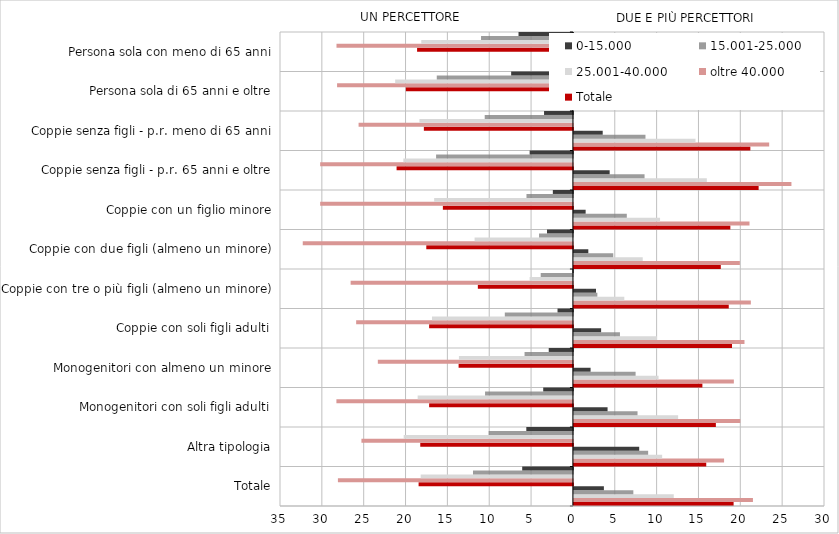
| Category | Totale | oltre 40.000 | 25.001-40.000 | 15.001-25.000 | 0-15.000 |
|---|---|---|---|---|---|
| Totale | -18.44 | -28.08 | -18.19 | -11.94 | -6.06 |
| Altra tipologia | -18.24 | -25.27 | -20.22 | -10.07 | -5.57 |
| Monogenitori con soli figli adulti | -17.18 | -28.26 | -18.55 | -10.5 | -3.55 |
| Monogenitori con almeno un minore | -13.66 | -23.31 | -13.62 | -5.78 | -2.89 |
| Coppie con soli figli adulti | -17.18 | -25.9 | -16.84 | -8.14 | -1.84 |
| Coppie con tre o più figli (almeno un minore) | -11.36 | -26.56 | -5.17 | -3.85 | -0.07 |
| Coppie con due figli (almeno un minore) | -17.52 | -32.28 | -11.75 | -4.05 | -3.1 |
| Coppie con un figlio minore | -15.54 | -30.2 | -16.58 | -5.55 | -2.4 |
| Coppie senza figli - p.r. 65 anni e oltre | -21.07 | -30.2 | -20.26 | -16.35 | -5.17 |
| Coppie senza figli - p.r. meno di 65 anni | -17.81 | -25.61 | -18.34 | -10.54 | -3.45 |
| Persona sola di 65 anni e oltre | -19.96 | -28.18 | -21.24 | -16.27 | -7.38 |
| Persona sola con meno di 65 anni | -18.62 | -28.25 | -18.12 | -10.98 | -6.5 |